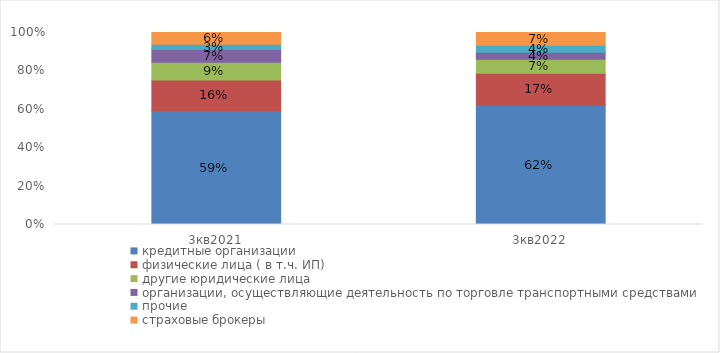
| Category | кредитные организации | физические лица ( в т.ч. ИП) | другие юридические лица | организации, осуществляющие деятельность по торговле транспортными средствами | прочие  | страховые брокеры  |
|---|---|---|---|---|---|---|
| 3кв2021 | 0.593 | 0.159 | 0.092 | 0.069 | 0.026 | 0.061 |
| 3кв2022 | 0.622 | 0.166 | 0.072 | 0.038 | 0.036 | 0.066 |